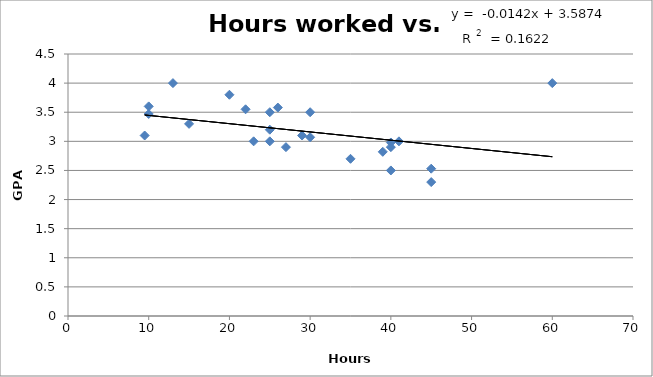
| Category | Series 0 |
|---|---|
| 40.0 | 2.9 |
| 30.0 | 3.5 |
| 26.0 | 3.58 |
| 41.0 | 3 |
| 40.0 | 2.98 |
| 60.0 | 4 |
| 9.5 | 3.1 |
| 25.0 | 3.5 |
| 40.0 | 2.5 |
| 35.0 | 2.7 |
| 45.0 | 2.3 |
| 10.0 | 3.6 |
| 25.0 | 3 |
| 27.0 | 2.9 |
| 39.0 | 2.82 |
| 25.0 | 3.2 |
| 15.0 | 3.3 |
| 22.0 | 3.55 |
| 20.0 | 3.8 |
| 30.0 | 3.07 |
| 13.0 | 4 |
| 29.0 | 3.1 |
| 23.0 | 3 |
| 10.0 | 3.47 |
| 45.0 | 2.53 |